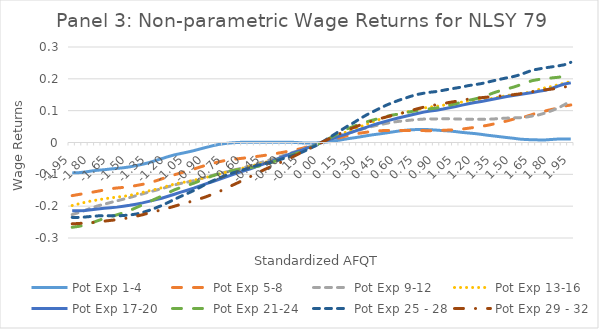
| Category | Pot Exp 1-4 | Pot Exp 5-8 | Pot Exp 9-12 | Pot Exp 13-16 | Pot Exp 17-20 | Pot Exp 21-24 | Pot Exp 25 - 28 | Pot Exp 29 - 32 |
|---|---|---|---|---|---|---|---|---|
| -1.95 | -0.095 | -0.167 | -0.226 | -0.198 | -0.215 | -0.266 | -0.235 | -0.255 |
| -1.9 | -0.095 | -0.163 | -0.22 | -0.193 | -0.214 | -0.264 | -0.235 | -0.254 |
| -1.85 | -0.093 | -0.16 | -0.213 | -0.188 | -0.214 | -0.26 | -0.234 | -0.253 |
| -1.8 | -0.09 | -0.157 | -0.206 | -0.184 | -0.211 | -0.253 | -0.232 | -0.252 |
| -1.75 | -0.087 | -0.153 | -0.199 | -0.18 | -0.209 | -0.246 | -0.231 | -0.25 |
| -1.7 | -0.086 | -0.149 | -0.194 | -0.177 | -0.207 | -0.239 | -0.23 | -0.247 |
| -1.65 | -0.083 | -0.145 | -0.189 | -0.174 | -0.205 | -0.233 | -0.23 | -0.245 |
| -1.6 | -0.081 | -0.143 | -0.183 | -0.171 | -0.203 | -0.227 | -0.231 | -0.243 |
| -1.55 | -0.079 | -0.141 | -0.178 | -0.169 | -0.2 | -0.221 | -0.229 | -0.239 |
| -1.5 | -0.076 | -0.139 | -0.173 | -0.166 | -0.197 | -0.214 | -0.228 | -0.236 |
| -1.45 | -0.073 | -0.135 | -0.167 | -0.162 | -0.194 | -0.205 | -0.225 | -0.232 |
| -1.4 | -0.068 | -0.131 | -0.161 | -0.157 | -0.19 | -0.196 | -0.22 | -0.227 |
| -1.35 | -0.063 | -0.127 | -0.156 | -0.152 | -0.185 | -0.187 | -0.213 | -0.221 |
| -1.3 | -0.057 | -0.121 | -0.15 | -0.147 | -0.18 | -0.177 | -0.206 | -0.216 |
| -1.25 | -0.051 | -0.114 | -0.145 | -0.142 | -0.175 | -0.168 | -0.198 | -0.211 |
| -1.2 | -0.044 | -0.108 | -0.139 | -0.136 | -0.169 | -0.158 | -0.188 | -0.206 |
| -1.15 | -0.039 | -0.101 | -0.133 | -0.131 | -0.163 | -0.149 | -0.178 | -0.2 |
| -1.1 | -0.035 | -0.095 | -0.128 | -0.126 | -0.156 | -0.141 | -0.169 | -0.194 |
| -1.05 | -0.03 | -0.089 | -0.124 | -0.123 | -0.15 | -0.135 | -0.16 | -0.188 |
| -1.0 | -0.026 | -0.084 | -0.12 | -0.119 | -0.143 | -0.128 | -0.151 | -0.183 |
| -0.94999999 | -0.02 | -0.077 | -0.114 | -0.114 | -0.136 | -0.12 | -0.141 | -0.177 |
| -0.89999998 | -0.015 | -0.071 | -0.108 | -0.109 | -0.129 | -0.112 | -0.13 | -0.17 |
| -0.85000002 | -0.01 | -0.065 | -0.103 | -0.104 | -0.123 | -0.104 | -0.12 | -0.162 |
| -0.80000001 | -0.006 | -0.06 | -0.098 | -0.099 | -0.116 | -0.098 | -0.112 | -0.154 |
| -0.75 | -0.003 | -0.056 | -0.093 | -0.094 | -0.109 | -0.092 | -0.103 | -0.145 |
| -0.69999999 | -0.001 | -0.053 | -0.088 | -0.088 | -0.102 | -0.088 | -0.096 | -0.135 |
| -0.64999998 | 0 | -0.051 | -0.083 | -0.084 | -0.095 | -0.085 | -0.09 | -0.126 |
| -0.60000002 | 0.001 | -0.049 | -0.078 | -0.079 | -0.088 | -0.082 | -0.084 | -0.116 |
| -0.55000001 | 0.001 | -0.046 | -0.072 | -0.074 | -0.082 | -0.079 | -0.078 | -0.106 |
| -0.5 | 0.001 | -0.044 | -0.066 | -0.068 | -0.074 | -0.075 | -0.072 | -0.096 |
| -0.44999999 | 0.001 | -0.041 | -0.06 | -0.063 | -0.067 | -0.07 | -0.067 | -0.086 |
| -0.40000001 | 0 | -0.038 | -0.054 | -0.058 | -0.06 | -0.064 | -0.063 | -0.077 |
| -0.34999999 | 0.001 | -0.034 | -0.048 | -0.052 | -0.052 | -0.057 | -0.057 | -0.068 |
| -0.30000001 | 0.001 | -0.031 | -0.041 | -0.046 | -0.044 | -0.049 | -0.051 | -0.059 |
| -0.25 | 0.001 | -0.027 | -0.034 | -0.039 | -0.037 | -0.042 | -0.044 | -0.05 |
| -0.2 | 0 | -0.023 | -0.028 | -0.031 | -0.03 | -0.035 | -0.038 | -0.04 |
| -0.15000001 | -0.001 | -0.018 | -0.022 | -0.024 | -0.023 | -0.027 | -0.03 | -0.03 |
| -0.1 | -0.002 | -0.012 | -0.015 | -0.016 | -0.015 | -0.018 | -0.02 | -0.02 |
| -0.050000001 | -0.002 | -0.006 | -0.007 | -0.008 | -0.007 | -0.01 | -0.011 | -0.01 |
| 2.220446e-16 | 0 | 0 | 0 | 0 | 0 | 0 | 0 | 0 |
| 0.050000001 | 0.002 | 0.006 | 0.007 | 0.009 | 0.007 | 0.011 | 0.012 | 0.01 |
| 0.1 | 0.005 | 0.011 | 0.015 | 0.018 | 0.014 | 0.022 | 0.025 | 0.019 |
| 0.15000001 | 0.008 | 0.016 | 0.022 | 0.026 | 0.021 | 0.033 | 0.038 | 0.029 |
| 0.2 | 0.012 | 0.021 | 0.028 | 0.034 | 0.027 | 0.043 | 0.05 | 0.038 |
| 0.25 | 0.014 | 0.026 | 0.034 | 0.042 | 0.034 | 0.051 | 0.062 | 0.047 |
| 0.30000001 | 0.018 | 0.029 | 0.04 | 0.049 | 0.041 | 0.058 | 0.074 | 0.054 |
| 0.34999999 | 0.021 | 0.032 | 0.046 | 0.057 | 0.048 | 0.065 | 0.086 | 0.061 |
| 0.40000001 | 0.024 | 0.035 | 0.051 | 0.065 | 0.054 | 0.07 | 0.096 | 0.068 |
| 0.44999999 | 0.027 | 0.037 | 0.055 | 0.072 | 0.061 | 0.076 | 0.106 | 0.074 |
| 0.5 | 0.03 | 0.038 | 0.059 | 0.079 | 0.066 | 0.081 | 0.116 | 0.08 |
| 0.55000001 | 0.033 | 0.038 | 0.063 | 0.085 | 0.072 | 0.086 | 0.124 | 0.085 |
| 0.60000002 | 0.036 | 0.038 | 0.066 | 0.09 | 0.077 | 0.089 | 0.132 | 0.089 |
| 0.64999998 | 0.038 | 0.038 | 0.068 | 0.095 | 0.082 | 0.093 | 0.139 | 0.095 |
| 0.69999999 | 0.04 | 0.038 | 0.07 | 0.099 | 0.086 | 0.097 | 0.145 | 0.1 |
| 0.75 | 0.041 | 0.038 | 0.072 | 0.104 | 0.091 | 0.101 | 0.151 | 0.106 |
| 0.80000001 | 0.041 | 0.037 | 0.074 | 0.108 | 0.095 | 0.103 | 0.155 | 0.111 |
| 0.85000002 | 0.04 | 0.037 | 0.074 | 0.111 | 0.099 | 0.106 | 0.158 | 0.115 |
| 0.89999998 | 0.039 | 0.037 | 0.074 | 0.114 | 0.102 | 0.108 | 0.16 | 0.119 |
| 0.94999999 | 0.037 | 0.038 | 0.075 | 0.117 | 0.105 | 0.113 | 0.164 | 0.122 |
| 1.0 | 0.036 | 0.039 | 0.075 | 0.121 | 0.109 | 0.117 | 0.168 | 0.126 |
| 1.05 | 0.034 | 0.04 | 0.074 | 0.124 | 0.113 | 0.122 | 0.171 | 0.129 |
| 1.1 | 0.032 | 0.042 | 0.074 | 0.127 | 0.117 | 0.127 | 0.174 | 0.133 |
| 1.15 | 0.03 | 0.045 | 0.073 | 0.13 | 0.122 | 0.132 | 0.179 | 0.136 |
| 1.2 | 0.028 | 0.048 | 0.073 | 0.132 | 0.125 | 0.137 | 0.182 | 0.139 |
| 1.25 | 0.026 | 0.051 | 0.073 | 0.134 | 0.129 | 0.142 | 0.185 | 0.141 |
| 1.3 | 0.023 | 0.054 | 0.073 | 0.136 | 0.133 | 0.149 | 0.19 | 0.143 |
| 1.35 | 0.02 | 0.058 | 0.074 | 0.139 | 0.137 | 0.157 | 0.194 | 0.144 |
| 1.4 | 0.018 | 0.063 | 0.076 | 0.144 | 0.14 | 0.163 | 0.199 | 0.146 |
| 1.45 | 0.016 | 0.068 | 0.077 | 0.147 | 0.144 | 0.168 | 0.203 | 0.148 |
| 1.5 | 0.013 | 0.073 | 0.077 | 0.151 | 0.147 | 0.174 | 0.207 | 0.15 |
| 1.55 | 0.011 | 0.078 | 0.078 | 0.154 | 0.151 | 0.18 | 0.212 | 0.153 |
| 1.6 | 0.009 | 0.082 | 0.08 | 0.156 | 0.154 | 0.188 | 0.22 | 0.156 |
| 1.65 | 0.009 | 0.088 | 0.083 | 0.16 | 0.157 | 0.194 | 0.227 | 0.16 |
| 1.7 | 0.008 | 0.094 | 0.087 | 0.166 | 0.161 | 0.198 | 0.231 | 0.163 |
| 1.75 | 0.008 | 0.099 | 0.093 | 0.172 | 0.164 | 0.201 | 0.235 | 0.166 |
| 1.8 | 0.01 | 0.104 | 0.1 | 0.176 | 0.17 | 0.203 | 0.238 | 0.168 |
| 1.85 | 0.011 | 0.108 | 0.108 | 0.181 | 0.177 | 0.205 | 0.241 | 0.17 |
| 1.9 | 0.011 | 0.115 | 0.119 | 0.186 | 0.184 | 0.208 | 0.244 | 0.174 |
| 1.95 | 0.011 | 0.118 | 0.13 | 0.191 | 0.187 | 0.213 | 0.252 | 0.179 |